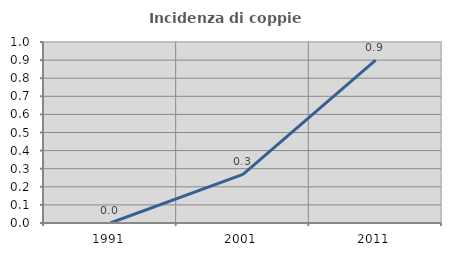
| Category | Incidenza di coppie miste |
|---|---|
| 1991.0 | 0 |
| 2001.0 | 0.269 |
| 2011.0 | 0.9 |